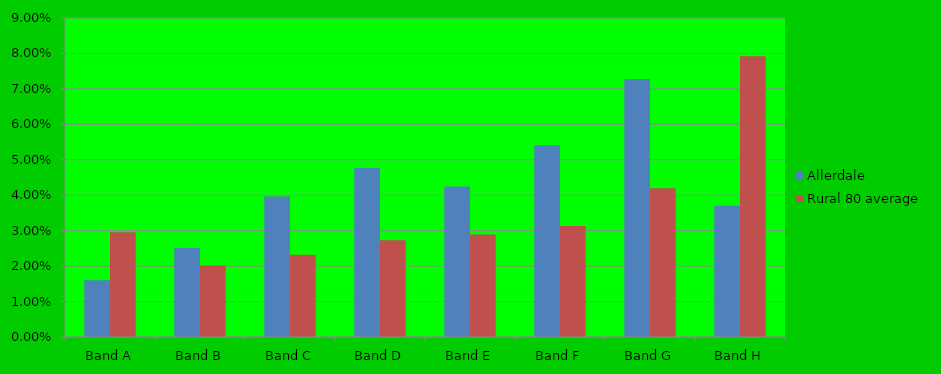
| Category | Allerdale | Rural 80 average |
|---|---|---|
| Band A | 0.016 | 0.03 |
| Band B | 0.025 | 0.02 |
| Band C | 0.04 | 0.023 |
| Band D | 0.048 | 0.027 |
| Band E | 0.042 | 0.029 |
| Band F | 0.054 | 0.031 |
| Band G | 0.073 | 0.042 |
| Band H | 0.037 | 0.079 |